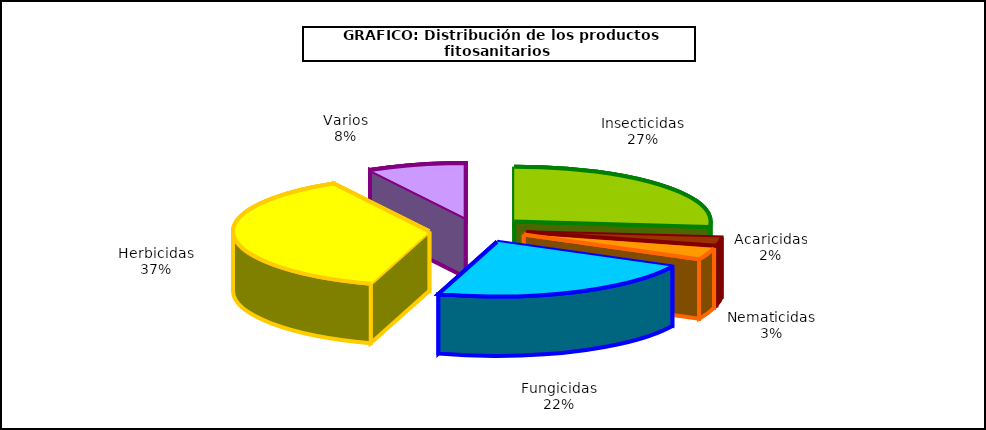
| Category | Insecticidas |
|---|---|
| Insecticidas | 285.136 |
| Acaricidas | 26.2 |
| Nematicidas | 37.245 |
| Fungicidas | 240.453 |
| Herbicidas | 398.257 |
| Varios | 87.048 |